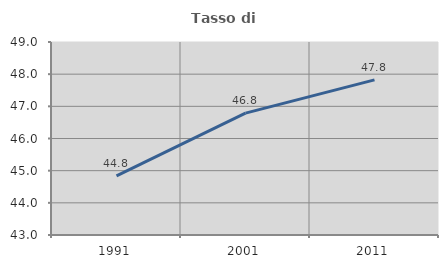
| Category | Tasso di occupazione   |
|---|---|
| 1991.0 | 44.835 |
| 2001.0 | 46.79 |
| 2011.0 | 47.823 |